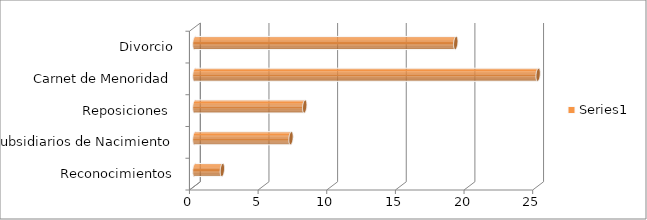
| Category | Series 0 |
|---|---|
| Reconocimientos | 2 |
| Subsidiarios de Nacimiento | 7 |
| Reposiciones  | 8 |
| Carnet de Menoridad | 25 |
| Divorcio | 19 |